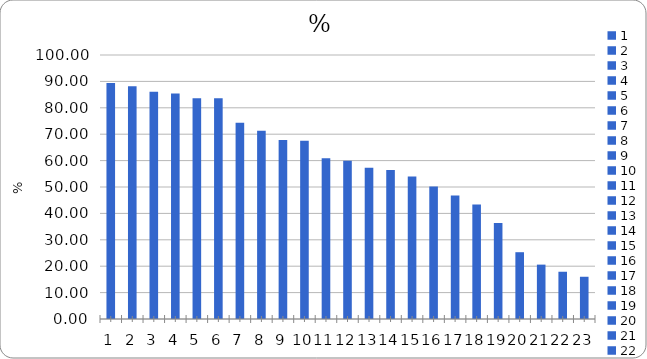
| Category | % |
|---|---|
| 0 | 89.4 |
| 1 | 88.2 |
| 2 | 86.1 |
| 3 | 85.4 |
| 4 | 83.6 |
| 5 | 83.6 |
| 6 | 74.3 |
| 7 | 71.3 |
| 8 | 67.8 |
| 9 | 67.5 |
| 10 | 60.9 |
| 11 | 59.9 |
| 12 | 57.3 |
| 13 | 56.4 |
| 14 | 54 |
| 15 | 50.2 |
| 16 | 46.8 |
| 17 | 43.4 |
| 18 | 36.4 |
| 19 | 25.3 |
| 20 | 20.6 |
| 21 | 17.9 |
| 22 | 16 |